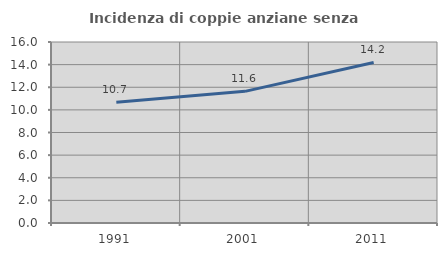
| Category | Incidenza di coppie anziane senza figli  |
|---|---|
| 1991.0 | 10.675 |
| 2001.0 | 11.638 |
| 2011.0 | 14.194 |